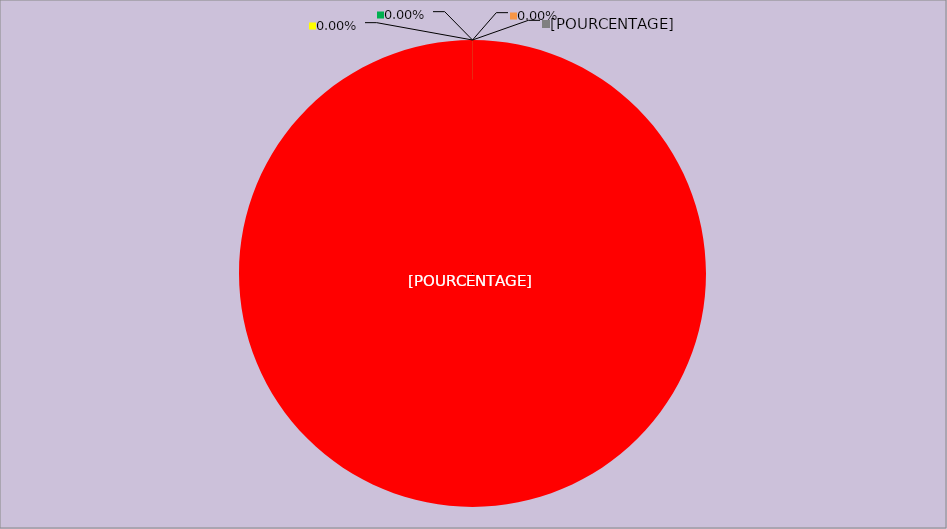
| Category | Année 2020 |
|---|---|
| Mesures non appliquées | 168 |
| Mesures appliquées mais peu ou pas documentées | 0 |
| Mesures appliquées et documentées | 0 |
| Mesures appliquées, documentées et contrôlées | 0 |
| Mesures non applicables | 0 |